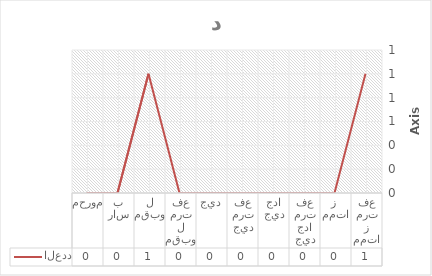
| Category | العدد |
|---|---|
| ممتاز مرتفع | 1 |
| ممتاز  | 0 |
| جيد جدا مرتفع | 0 |
| جيد جدا | 0 |
| جيد مرتفع | 0 |
| جيد | 0 |
| مقبول مرتفع | 0 |
| مقبول | 1 |
| راسب | 0 |
| محروم | 0 |